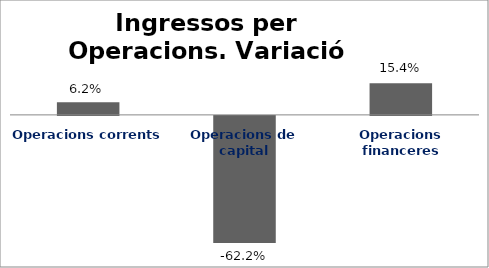
| Category | Series 0 |
|---|---|
| Operacions corrents | 0.062 |
| Operacions de capital | -0.622 |
| Operacions financeres | 0.154 |